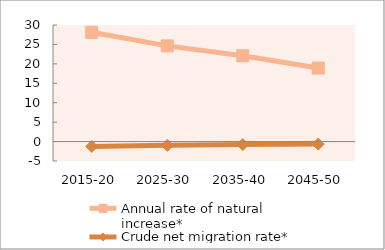
| Category | Annual rate of natural increase* | Crude net migration rate* |
|---|---|---|
| 2015-20 | 28.119 | -1.246 |
| 2025-30 | 24.622 | -0.969 |
| 2035-40 | 22.078 | -0.774 |
| 2045-50 | 18.911 | -0.635 |